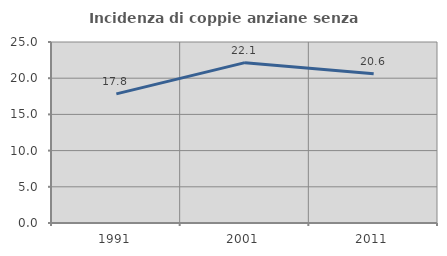
| Category | Incidenza di coppie anziane senza figli  |
|---|---|
| 1991.0 | 17.834 |
| 2001.0 | 22.148 |
| 2011.0 | 20.625 |